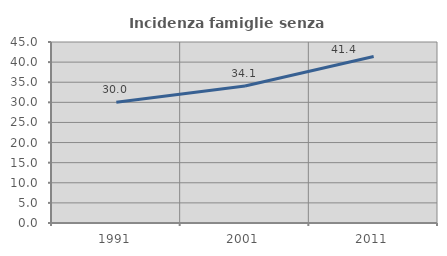
| Category | Incidenza famiglie senza nuclei |
|---|---|
| 1991.0 | 30 |
| 2001.0 | 34.066 |
| 2011.0 | 41.379 |